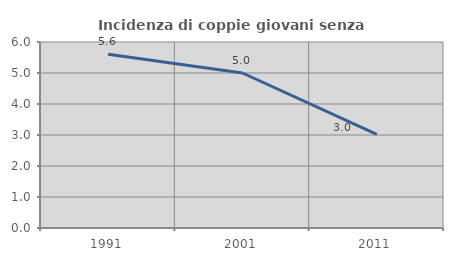
| Category | Incidenza di coppie giovani senza figli |
|---|---|
| 1991.0 | 5.607 |
| 2001.0 | 5 |
| 2011.0 | 3.017 |